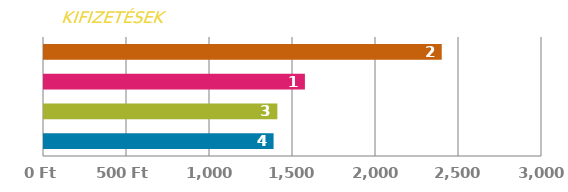
| Category | KIFIZETÉS |
|---|---|
| 0 | 1382.921 |
| 1 | 1405.775 |
| 2 | 1571.655 |
| 3 | 2396.046 |